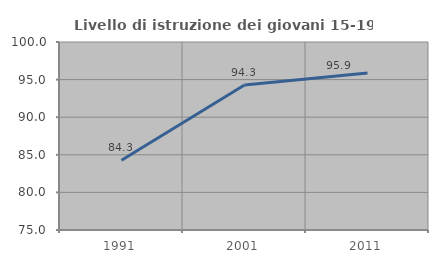
| Category | Livello di istruzione dei giovani 15-19 anni |
|---|---|
| 1991.0 | 84.279 |
| 2001.0 | 94.278 |
| 2011.0 | 95.89 |